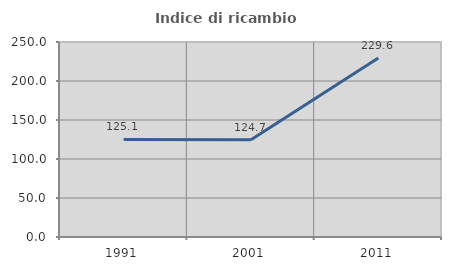
| Category | Indice di ricambio occupazionale  |
|---|---|
| 1991.0 | 125.131 |
| 2001.0 | 124.691 |
| 2011.0 | 229.609 |